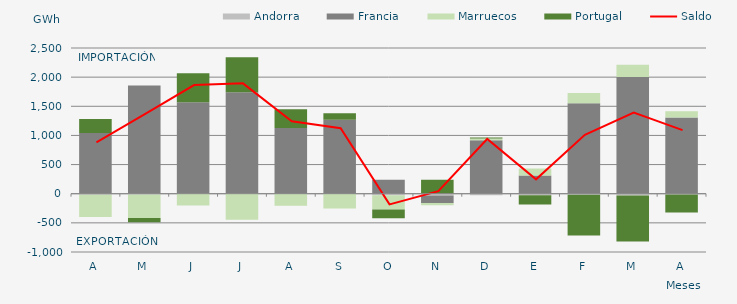
| Category | Andorra | Francia | Marruecos | Portugal |
|---|---|---|---|---|
| A | -19.567 | 1043.23 | -378.646 | 237.582 |
| M | -12.003 | 1858.226 | -405.06 | -72.803 |
| J | -0.136 | 1569.713 | -200.627 | 495.014 |
| J | -0.226 | 1742.725 | -445.987 | 597.215 |
| A | -4.615 | 1125.357 | -201.623 | 324.903 |
| S | -3.339 | 1270.11 | -251.758 | 109.449 |
| O | -26.446 | 240.099 | -243.372 | -152.75 |
| N | -30.553 | -129.248 | -36.387 | 240.868 |
| D | -24.685 | 915.885 | 32.032 | 15.954 |
| E | -26.717 | 310.511 | 121.876 | -159.316 |
| F | -15.973 | 1550.723 | 179.304 | -702.278 |
| M | -32.372 | 2000.98 | 212.165 | -788.594 |
| A | -13.98 | 1308.271 | 106.522 | -309.693 |